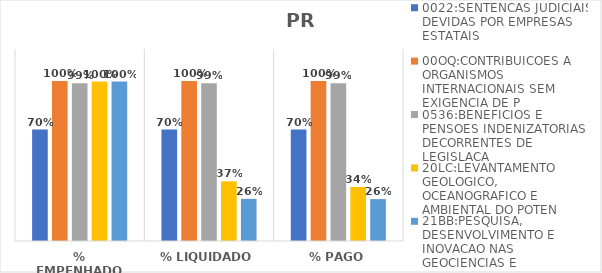
| Category | 0022:SENTENCAS JUDICIAIS DEVIDAS POR EMPRESAS ESTATAIS | 00OQ:CONTRIBUICOES A ORGANISMOS INTERNACIONAIS SEM EXIGENCIA DE P | 0536:BENEFICIOS E PENSOES INDENIZATORIAS DECORRENTES DE LEGISLACA | 20LC:LEVANTAMENTO GEOLOGICO, OCEANOGRAFICO E AMBIENTAL DO POTEN | 21BB:PESQUISA, DESENVOLVIMENTO E INOVACAO NAS GEOCIENCIAS E |
|---|---|---|---|---|---|
| % EMPENHADO | 0.697 | 1 | 0.985 | 0.996 | 0.997 |
| % LIQUIDADO | 0.697 | 1 | 0.985 | 0.373 | 0.263 |
| % PAGO | 0.697 | 1 | 0.985 | 0.338 | 0.262 |